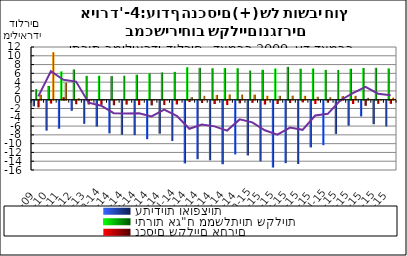
| Category | עתידיות ואופציות | יתרות אג"ח ממשלתיות שקליות | נכסים שקליים אחרים | יתרות מק"מ |
|---|---|---|---|---|
| 2009-12-01 | -1.293 | 2.412 | -1.522 | 1.156 |
| 2010-12-01 | -6.807 | 3.131 | -0.639 | 10.809 |
| 2011-12-01 | -6.38 | 6.451 | 0.577 | 3.873 |
| 2012-12-01 | -2.3 | 6.89 | -0.802 | 0.333 |
| 2013-12-01 | -5.272 | 5.434 | -0.866 | 0.031 |
| 2014-01-01 | -5.899 | 5.454 | -0.941 | 0.027 |
| 2014-02-01 | -7.431 | 5.377 | -1.035 | 0.025 |
| 2014-03-01 | -7.747 | 5.464 | -0.891 | 0.03 |
| 2014-04-01 | -7.833 | 5.691 | -0.99 | 0.044 |
| 2014-05-01 | -8.763 | 5.998 | -1.072 | 0.042 |
| 2014-06-01 | -7.503 | 6.21 | -0.973 | 0.03 |
| 2014-07-01 | -9.185 | 6.336 | -0.856 | 0.03 |
| 2014-08-01 | -14.268 | 7.388 | -0.317 | 0.588 |
| 2014-09-01 | -13.311 | 7.273 | -0.522 | 0.891 |
| 2014-10-01 | -13.563 | 7.165 | -0.759 | 1.086 |
| 2014-11-01 | -14.457 | 7.193 | -0.97 | 1.199 |
| 2014-12-01 | -12.222 | 7.166 | -0.598 | 1.176 |
| 2015-01-01 | -12.454 | 6.637 | -0.495 | 1.16 |
| 2015-02-01 | -13.794 | 6.809 | -0.875 | 0.901 |
| 2015-03-01 | -15.215 | 7.101 | -0.754 | 0.895 |
| 2015-04-01 | -14.216 | 7.478 | -0.522 | 0.921 |
| 2015-05-01 | -14.412 | 7.055 | -0.386 | 0.887 |
| 2015-06-01 | -10.628 | 7.089 | -0.738 | 0.679 |
| 2015-07-01 | -10.123 | 6.79 | -0.454 | 0.578 |
| 2015-08-01 | -7.551 | 6.779 | -0.159 | 0.821 |
| 2015-09-01 | -5.688 | 7.053 | -0.739 | 0.886 |
| 2015-10-01 | -3.576 | 7.209 | -1.159 | 0.43 |
| 2015-11-01 | -5.35 | 7.268 | -0.717 | 0.157 |
| 2015-12-01 | -5.852 | 7.127 | -0.701 | 0.462 |